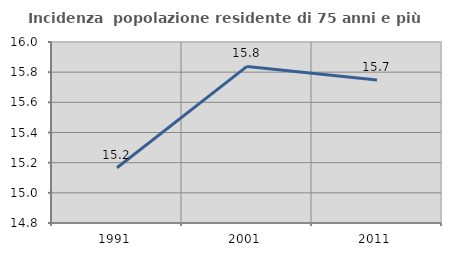
| Category | Incidenza  popolazione residente di 75 anni e più |
|---|---|
| 1991.0 | 15.166 |
| 2001.0 | 15.838 |
| 2011.0 | 15.748 |